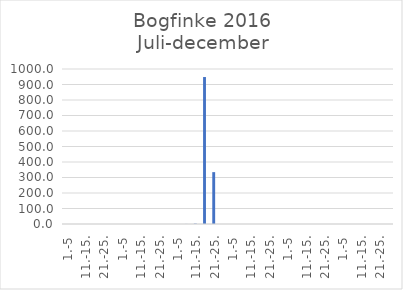
| Category | Series 0 |
|---|---|
| 1.-5 | 0 |
| 6.-10. | 0 |
| 11.-15. | 0 |
| 16.-20. | 0 |
| 21.-25. | 0 |
| 26.-31. | 0 |
| 1.-5 | 0 |
| 6.-10. | 0 |
| 11.-15. | 0 |
| 16.-20. | 0 |
| 21.-25. | 0 |
| 26.-31. | 0 |
| 1.-5 | 0 |
| 6.-10. | 0.383 |
| 11.-15. | 2.435 |
| 16.-20. | 948.179 |
| 21.-25. | 334.562 |
| 26.-30. | 0 |
| 1.-5 | 0 |
| 6.-10. | 0 |
| 11.-15. | 0 |
| 16.-20. | 0 |
| 21.-25. | 0 |
| 26.-31. | 0 |
| 1.-5 | 0 |
| 6.-10. | 0.053 |
| 11.-15. | 0 |
| 16.-20. | 0 |
| 21.-25. | 0 |
| 26.-30. | 0 |
| 1.-5 | 0 |
| 6.-10. | 0 |
| 11.-15. | 0 |
| 16.-20. | 0 |
| 21.-25. | 0 |
| 26.-31. | 0 |